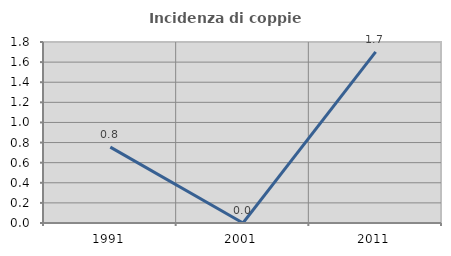
| Category | Incidenza di coppie miste |
|---|---|
| 1991.0 | 0.755 |
| 2001.0 | 0 |
| 2011.0 | 1.702 |